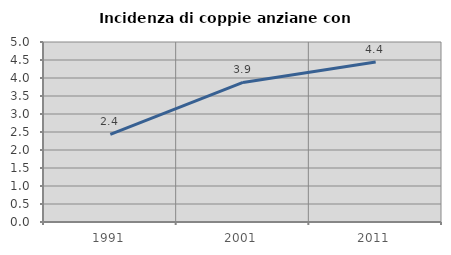
| Category | Incidenza di coppie anziane con figli |
|---|---|
| 1991.0 | 2.436 |
| 2001.0 | 3.878 |
| 2011.0 | 4.442 |